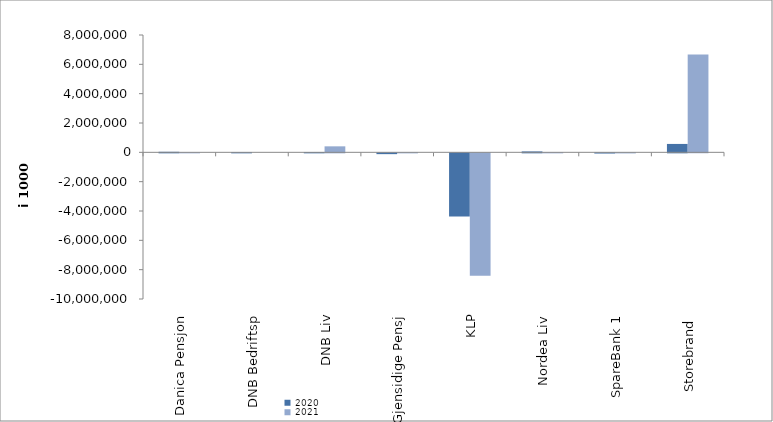
| Category | 2020 | 2021 |
|---|---|---|
| Danica Pensjon | 36499.559 | 917.594 |
| DNB Bedriftsp | 7508 | 0 |
| DNB Liv | 13951.686 | 408944.981 |
| Gjensidige Pensj | -55290 | -1853 |
| KLP | -4298472.749 | -8346122.359 |
| Nordea Liv | 62384 | 1913 |
| SpareBank 1 | -14340.871 | -4756.54 |
| Storebrand  | 572543.809 | 6662972.674 |